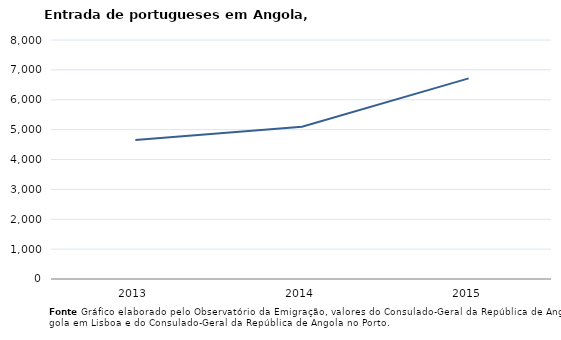
| Category | Entradas |
|---|---|
| 2013.0 | 4651 |
| 2014.0 | 5098 |
| 2015.0 | 6715 |